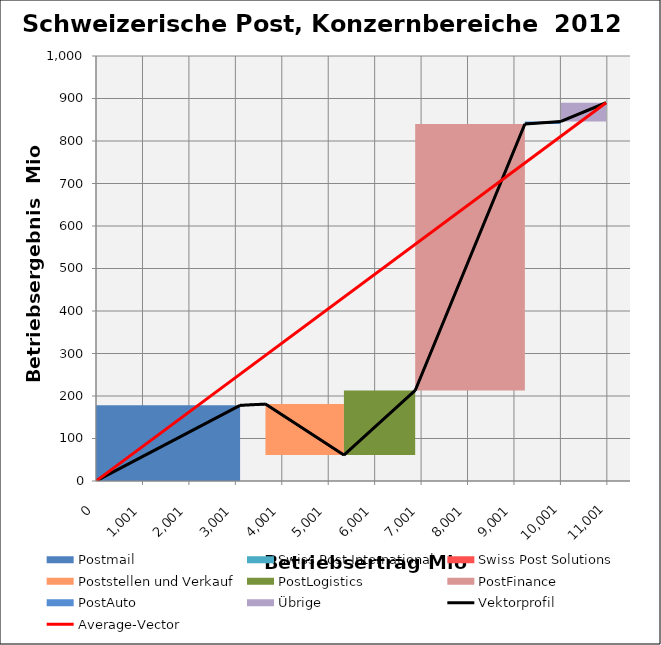
| Category | transparent | Postmail | Swiss Post International | Swiss Post Solutions | Poststellen und Verkauf | PostLogistics | PostFinance | PostAuto | Übrige | Border right & top |
|---|---|---|---|---|---|---|---|---|---|---|
| 0.0 | 0 | 178 | 0 | 0 | 0 | 0 | 0 | 0 | 0 | 0 |
| 3103.0 | 0 | 178 | 0 | 0 | 0 | 0 | 0 | 0 | 0 | 0 |
| 3103.0 | 178 | 0 | 0 | 0 | 0 | 0 | 0 | 0 | 0 | 0 |
| 3103.0 | 178 | 0 | 0 | 0 | 0 | 0 | 0 | 0 | 0 | 0 |
| 3103.0 | 178 | 0 | 0 | 3 | 0 | 0 | 0 | 0 | 0 | 0 |
| 3650.0 | 178 | 0 | 0 | 3 | 0 | 0 | 0 | 0 | 0 | 0 |
| 3650.0 | 181 | 0 | 0 | 0 | -120 | 0 | 0 | 0 | 0 | 0 |
| 5339.0 | 181 | 0 | 0 | 0 | -120 | 0 | 0 | 0 | 0 | 0 |
| 5339.0 | 61 | 0 | 0 | 0 | 0 | 152 | 0 | 0 | 0 | 0 |
| 6874.0 | 61 | 0 | 0 | 0 | 0 | 152 | 0 | 0 | 0 | 0 |
| 6874.0 | 213 | 0 | 0 | 0 | 0 | 0 | 627 | 0 | 0 | 0 |
| 9236.0 | 213 | 0 | 0 | 0 | 0 | 0 | 627 | 0 | 0 | 0 |
| 9236.0 | 840 | 0 | 0 | 0 | 0 | 0 | 0 | 6 | 0 | 0 |
| 10014.0 | 840 | 0 | 0 | 0 | 0 | 0 | 0 | 6 | 0 | 0 |
| 10014.0 | 846 | 0 | 0 | 0 | 0 | 0 | 0 | 0 | 44 | 0 |
| 10984.0 | 846 | 0 | 0 | 0 | 0 | 0 | 0 | 0 | 44 | 0 |
| 10984.0 | 890 | 0 | 0 | 0 | 0 | 0 | 0 | 0 | 0 | 0 |
| 10984.0 | 890 | 0 | 0 | 0 | 0 | 0 | 0 | 0 | 0 | 0 |
| 10984.0 | 890 | 0 | 0 | 0 | 0 | 0 | 0 | 0 | 0 | 0 |
| 10984.0 | 890 | 0 | 0 | 0 | 0 | 0 | 0 | 0 | 0 | 0 |
| 10984.0 | 890 | 0 | 0 | 0 | 0 | 0 | 0 | 0 | 0 | 0 |
| 11500.0 | 890 | 0 | 0 | 0 | 0 | 0 | 0 | 0 | 0 | 0 |
| 11500.0 | 890 | 0 | 0 | 0 | 0 | 0 | 0 | 0 | 0 | 0 |